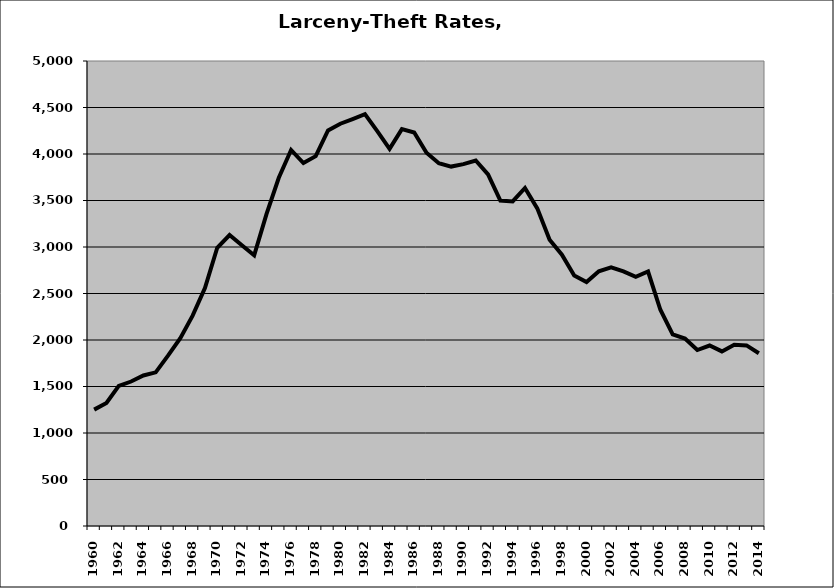
| Category | Larceny-Theft |
|---|---|
| 1960.0 | 1251.406 |
| 1961.0 | 1322.347 |
| 1962.0 | 1507.079 |
| 1963.0 | 1553.544 |
| 1964.0 | 1618.973 |
| 1965.0 | 1652.209 |
| 1966.0 | 1831.31 |
| 1967.0 | 2019.494 |
| 1968.0 | 2262.012 |
| 1969.0 | 2559.19 |
| 1970.0 | 2992.082 |
| 1971.0 | 3128.471 |
| 1972.0 | 3018.838 |
| 1973.0 | 2910.587 |
| 1974.0 | 3354.247 |
| 1975.0 | 3744.002 |
| 1976.0 | 4043.477 |
| 1977.0 | 3903.207 |
| 1978.0 | 3976.966 |
| 1979.0 | 4253.175 |
| 1980.0 | 4325.795 |
| 1981.0 | 4375.903 |
| 1982.0 | 4429.327 |
| 1983.0 | 4245.651 |
| 1984.0 | 4054.72 |
| 1985.0 | 4267.038 |
| 1986.0 | 4230.762 |
| 1987.0 | 4012.925 |
| 1988.0 | 3900.638 |
| 1989.0 | 3864.787 |
| 1990.0 | 3890.609 |
| 1991.0 | 3930.027 |
| 1992.0 | 3780.086 |
| 1993.0 | 3499.355 |
| 1994.0 | 3490.153 |
| 1995.0 | 3634.481 |
| 1996.0 | 3415.538 |
| 1997.0 | 3077.344 |
| 1998.0 | 2917.93 |
| 1999.0 | 2692.91 |
| 2000.0 | 2623.486 |
| 2001.0 | 2738.892 |
| 2002.0 | 2781.417 |
| 2003.0 | 2737.6 |
| 2004.0 | 2679.548 |
| 2005.0 | 2736.306 |
| 2006.0 | 2325.084 |
| 2007.0 | 2061.106 |
| 2008.0 | 2015.475 |
| 2009.0 | 1892.214 |
| 2010.0 | 1940.509 |
| 2011.0 | 1877.411 |
| 2012.0 | 1948.007 |
| 2013.0 | 1941.831 |
| 2014.0 | 1857.104 |